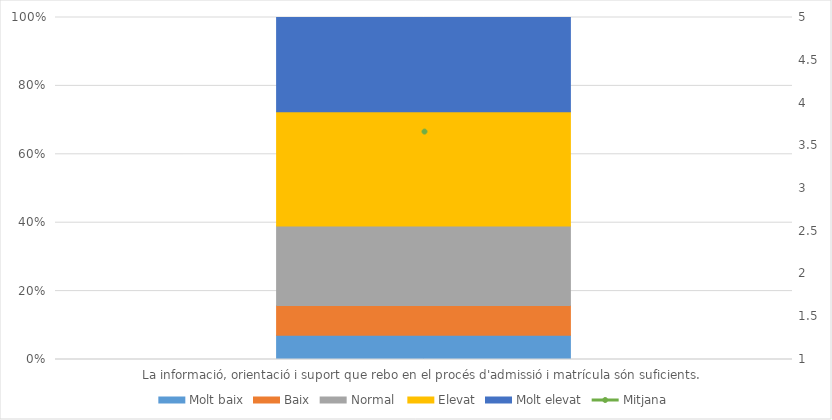
| Category | Molt baix | Baix | Normal  | Elevat | Molt elevat |
|---|---|---|---|---|---|
| La informació, orientació i suport que rebo en el procés d'admissió i matrícula són suficients. | 23 | 28 | 75 | 108 | 89 |